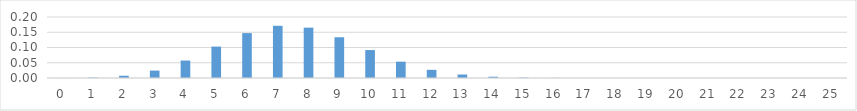
| Category | Series 0 |
|---|---|
| 0.0 | 0 |
| 1.0 | 0.001 |
| 2.0 | 0.007 |
| 3.0 | 0.024 |
| 4.0 | 0.057 |
| 5.0 | 0.103 |
| 6.0 | 0.147 |
| 7.0 | 0.171 |
| 8.0 | 0.165 |
| 9.0 | 0.134 |
| 10.0 | 0.092 |
| 11.0 | 0.054 |
| 12.0 | 0.027 |
| 13.0 | 0.011 |
| 14.0 | 0.004 |
| 15.0 | 0.001 |
| 16.0 | 0 |
| 17.0 | 0 |
| 18.0 | 0 |
| 19.0 | 0 |
| 20.0 | 0 |
| 21.0 | 0 |
| 22.0 | 0 |
| 23.0 | 0 |
| 24.0 | 0 |
| 25.0 | 0 |